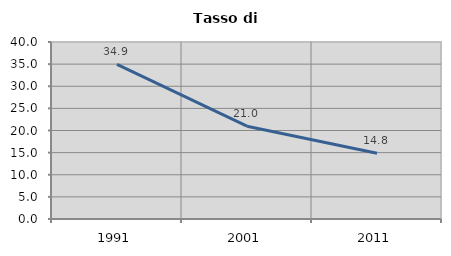
| Category | Tasso di disoccupazione   |
|---|---|
| 1991.0 | 34.928 |
| 2001.0 | 20.973 |
| 2011.0 | 14.847 |